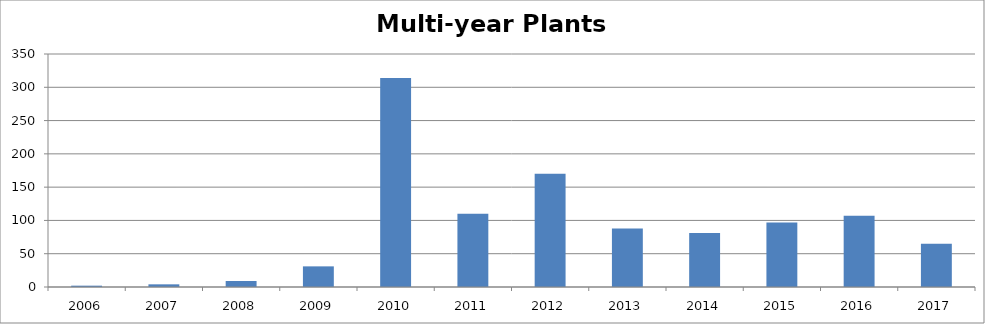
| Category | Multi-year Plants Observations |
|---|---|
| 2006.0 | 2 |
| 2007.0 | 4 |
| 2008.0 | 9 |
| 2009.0 | 31 |
| 2010.0 | 314 |
| 2011.0 | 110 |
| 2012.0 | 170 |
| 2013.0 | 88 |
| 2014.0 | 81 |
| 2015.0 | 97 |
| 2016.0 | 107 |
| 2017.0 | 65 |